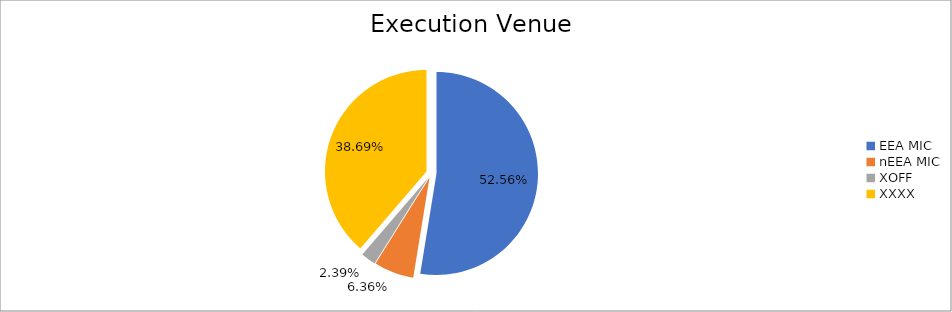
| Category | Series 0 |
|---|---|
| EEA MIC | 6003888.777 |
| nEEA MIC | 726055.186 |
| XOFF | 273051.084 |
| XXXX | 4419561.57 |